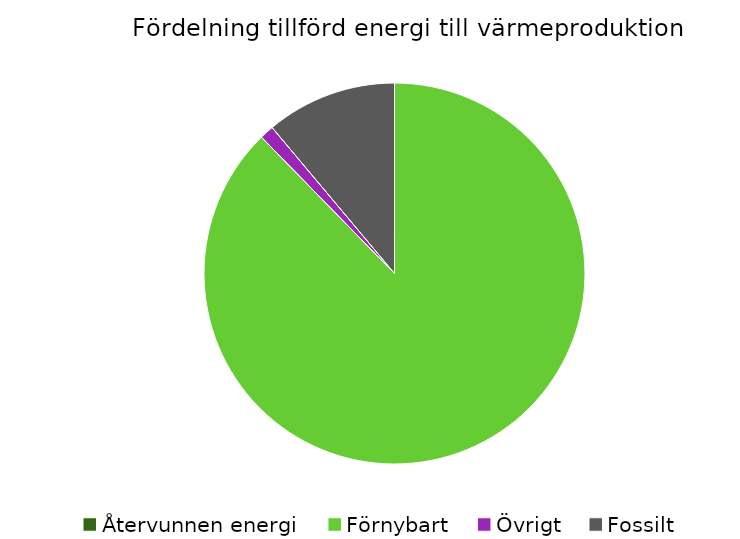
| Category | Fördelning värmeproduktion |
|---|---|
| Återvunnen energi | 0 |
| Förnybart | 0.877 |
| Övrigt | 0.012 |
| Fossilt | 0.111 |